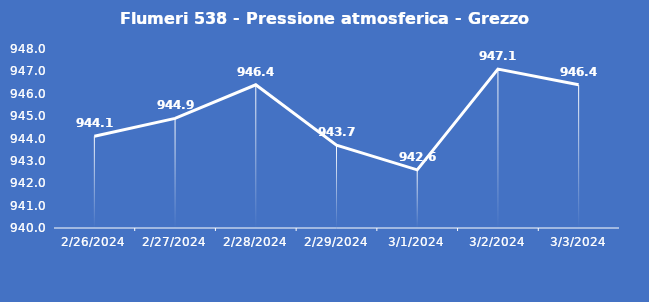
| Category | Flumeri 538 - Pressione atmosferica - Grezzo (hPa) |
|---|---|
| 2/26/24 | 944.1 |
| 2/27/24 | 944.9 |
| 2/28/24 | 946.4 |
| 2/29/24 | 943.7 |
| 3/1/24 | 942.6 |
| 3/2/24 | 947.1 |
| 3/3/24 | 946.4 |